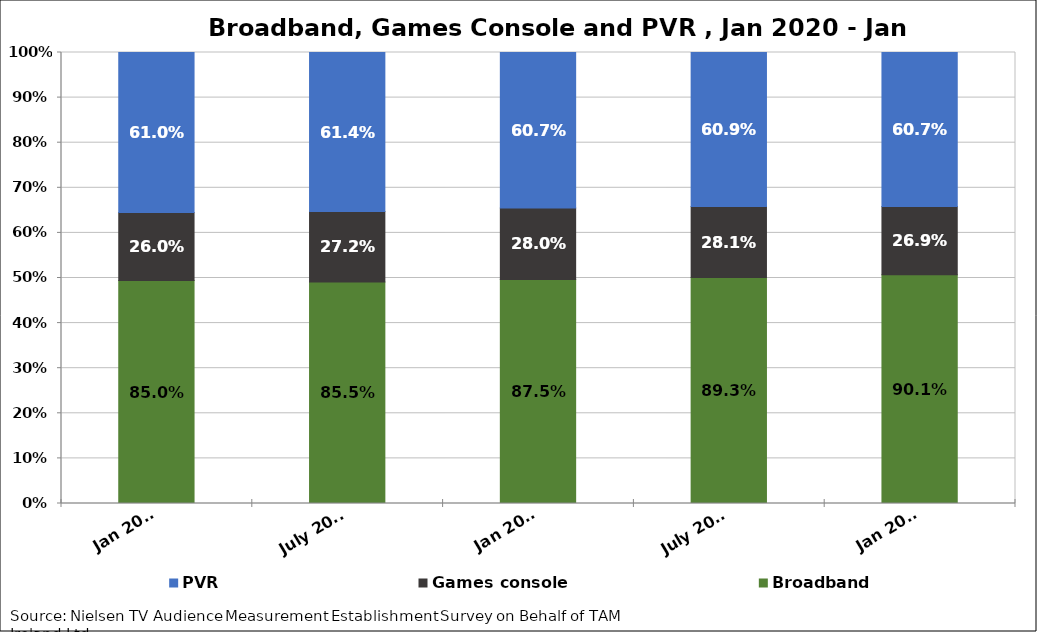
| Category | Broadband | Games console | PVR |
|---|---|---|---|
| Jan 2020 | 0.85 | 0.26 | 0.61 |
| July 2020 | 0.855 | 0.272 | 0.614 |
| Jan 2021 | 0.875 | 0.28 | 0.607 |
| July 2021 | 0.893 | 0.281 | 0.609 |
| Jan 2022 | 0.901 | 0.269 | 0.607 |